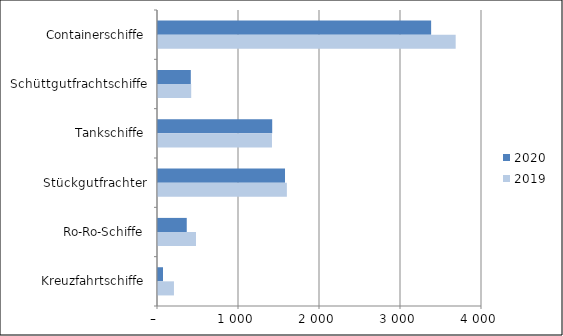
| Category | 2020 | 2019 |
|---|---|---|
| Containerschiffe | 3372 | 3675 |
| Schüttgutfrachtschiffe | 405 | 410 |
| Tankschiffe | 1410 | 1407 |
| Stückgutfrachter | 1568 | 1591 |
| Ro-Ro-Schiffe | 355 | 469 |
| Kreuzfahrtschiffe | 62 | 197 |